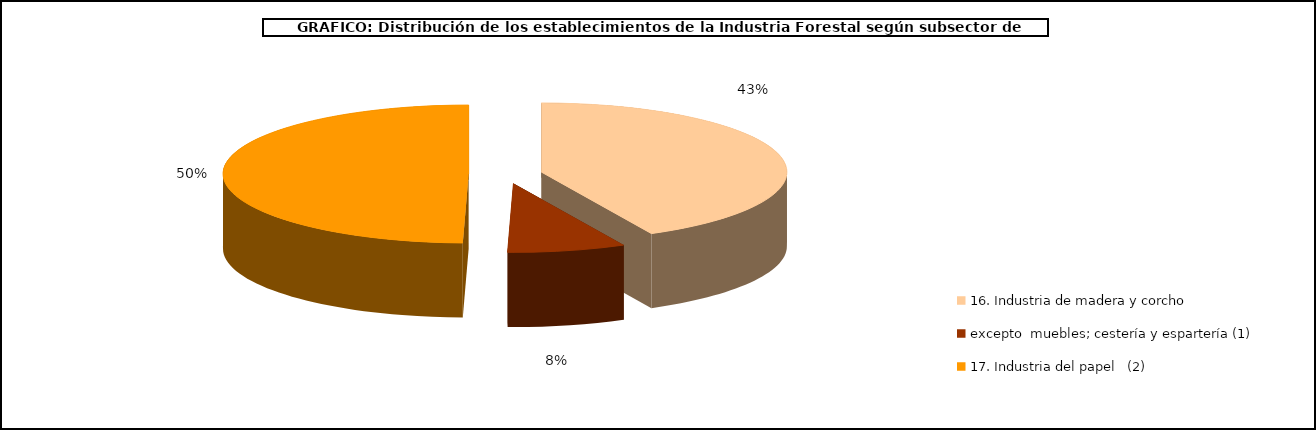
| Category | 16. Industria de madera y corcho, excepto  muebles; cestería y espartería (1) |
|---|---|
| 0 | 11313 |
| 1 | 2068 |
| 2 | 13179 |